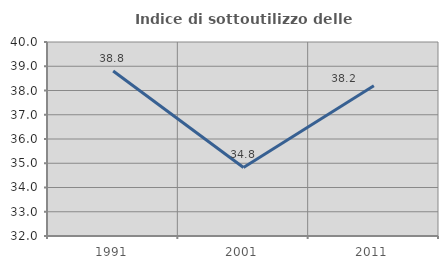
| Category | Indice di sottoutilizzo delle abitazioni  |
|---|---|
| 1991.0 | 38.803 |
| 2001.0 | 34.827 |
| 2011.0 | 38.2 |